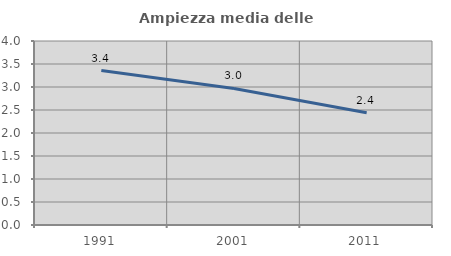
| Category | Ampiezza media delle famiglie |
|---|---|
| 1991.0 | 3.359 |
| 2001.0 | 2.969 |
| 2011.0 | 2.438 |